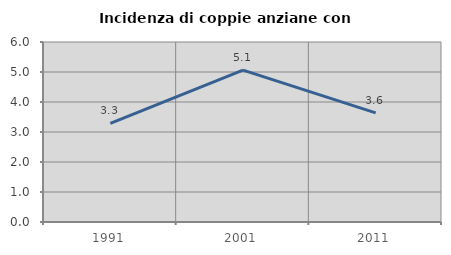
| Category | Incidenza di coppie anziane con figli |
|---|---|
| 1991.0 | 3.289 |
| 2001.0 | 5.065 |
| 2011.0 | 3.638 |